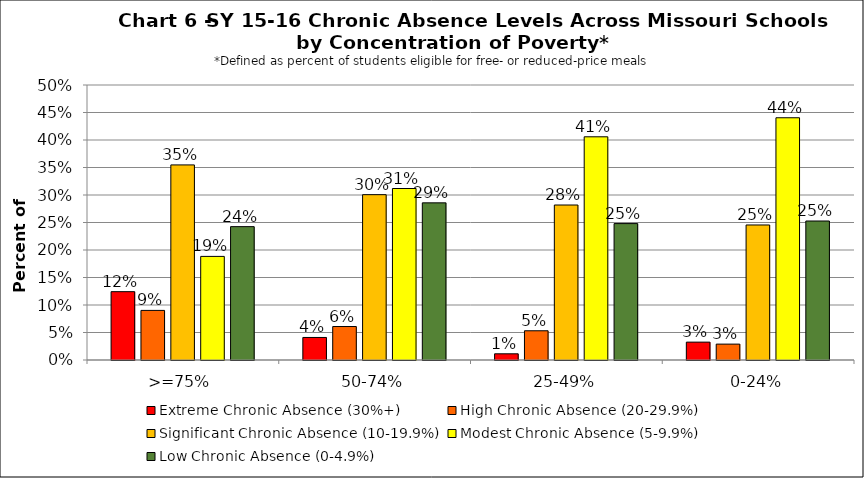
| Category | Extreme Chronic Absence (30%+) | High Chronic Absence (20-29.9%) | Significant Chronic Absence (10-19.9%) | Modest Chronic Absence (5-9.9%) | Low Chronic Absence (0-4.9%) |
|---|---|---|---|---|---|
| 0 | 0.124 | 0.09 | 0.355 | 0.188 | 0.242 |
| 1 | 0.041 | 0.061 | 0.301 | 0.312 | 0.286 |
| 2 | 0.011 | 0.053 | 0.282 | 0.406 | 0.248 |
| 3 | 0.032 | 0.029 | 0.245 | 0.44 | 0.253 |